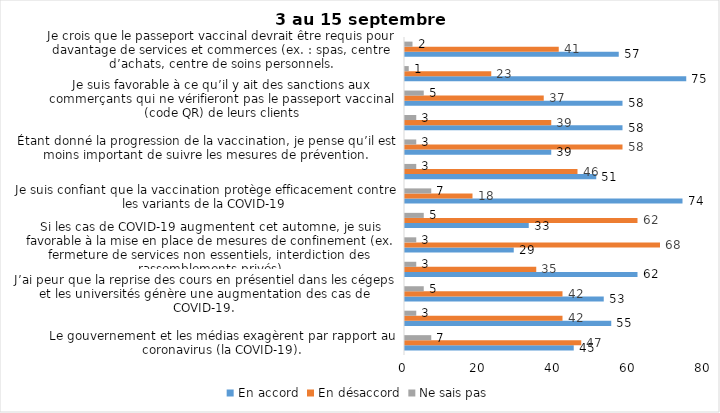
| Category | En accord | En désaccord | Ne sais pas |
|---|---|---|---|
| Le gouvernement et les médias exagèrent par rapport au coronavirus (la COVID-19). | 45 | 47 | 7 |
| J’ai peur que le système de santé soit débordé par les cas de COVID-19 suite au "déconfinement" | 55 | 42 | 3 |
| J’ai peur que la reprise des cours en présentiel dans les cégeps et les universités génère une augmentation des cas de COVID-19. | 53 | 42 | 5 |
| Je suis favorable au passeport vaccinal qui permettrait l'accès à certains lieux ou activités aux personnes vaccinées. | 62 | 35 | 3 |
| Si les cas de COVID-19 augmentent cet automne, je suis favorable à la mise en place de mesures de confinement (ex. fermeture de services non essentiels, interdiction des rassemblements privés) | 29 | 68 | 3 |
| Je suis inquiet de contracter le variant Delta de la Covid-19 | 33 | 62 | 5 |
| Je suis confiant que la vaccination protège efficacement contre les variants de la COVID-19 | 74 | 18 | 7 |
| Je suis favorable à ce que le port du masque ne soit plus obligatoire au Québec. | 51 | 46 | 3 |
| Étant donné la progression de la vaccination, je pense qu’il est moins important de suivre les mesures de prévention. | 39 | 58 | 3 |
| J'ai peur que la reprise des cours en présentiel dans les écoles primaires et secondaires génère une augmentation des cas de COVID-19 | 58 | 39 | 3 |
| Je suis favorable à ce qu’il y ait des sanctions aux commerçants qui ne vérifieront pas le passeport vaccinal (code QR) de leurs clients | 58 | 37 | 5 |
| Je suis favorable à ce qu’il y ait des sanctions aux gens qui tenteront de frauder leur passeport vaccinal par des amendes ou des accusations criminelles. | 75 | 23 | 1 |
| Je crois que le passeport vaccinal devrait être requis pour davantage de services et commerces (ex. : spas, centre d’achats, centre de soins personnels. | 57 | 41 | 2 |